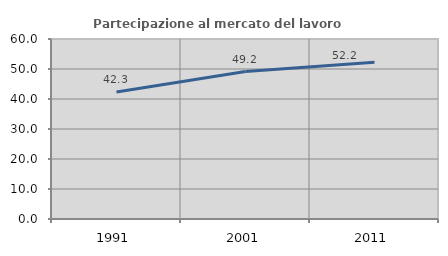
| Category | Partecipazione al mercato del lavoro  femminile |
|---|---|
| 1991.0 | 42.318 |
| 2001.0 | 49.159 |
| 2011.0 | 52.229 |